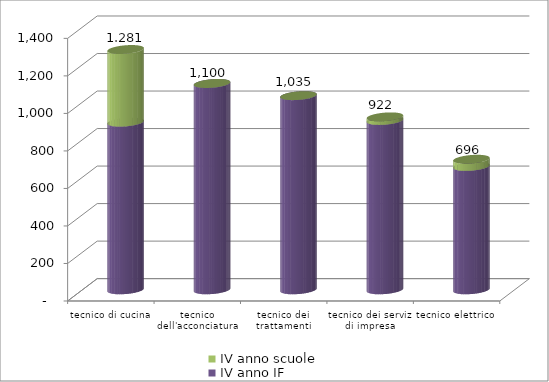
| Category | IV anno IF | IV anno scuole |
|---|---|---|
| tecnico di cucina | 894 | 387 |
| tecnico dell'acconciatura | 1100 | 0 |
| tecnico dei trattamenti estetici | 1035 | 0 |
| tecnico dei servizi di impresa | 903 | 19 |
| tecnico elettrico | 658 | 38 |